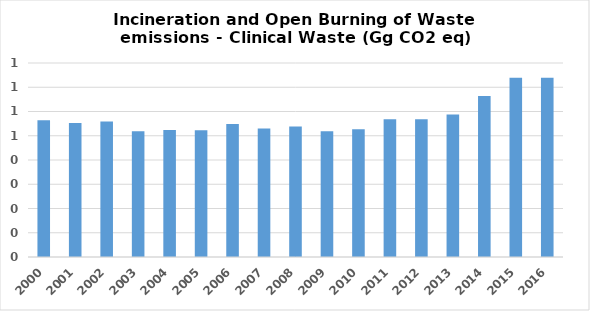
| Category | Series 0 |
|---|---|
| 2000.0 | 0.564 |
| 2001.0 | 0.552 |
| 2002.0 | 0.559 |
| 2003.0 | 0.519 |
| 2004.0 | 0.523 |
| 2005.0 | 0.523 |
| 2006.0 | 0.548 |
| 2007.0 | 0.529 |
| 2008.0 | 0.538 |
| 2009.0 | 0.518 |
| 2010.0 | 0.527 |
| 2011.0 | 0.568 |
| 2012.0 | 0.568 |
| 2013.0 | 0.588 |
| 2014.0 | 0.663 |
| 2015.0 | 0.739 |
| 2016.0 | 0.74 |